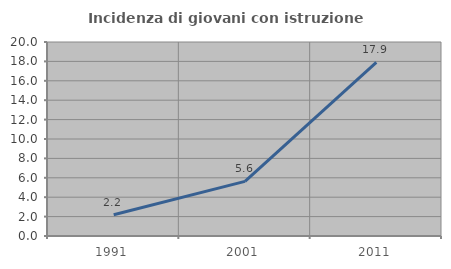
| Category | Incidenza di giovani con istruzione universitaria |
|---|---|
| 1991.0 | 2.186 |
| 2001.0 | 5.634 |
| 2011.0 | 17.906 |